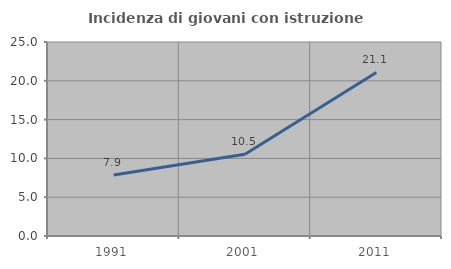
| Category | Incidenza di giovani con istruzione universitaria |
|---|---|
| 1991.0 | 7.856 |
| 2001.0 | 10.526 |
| 2011.0 | 21.075 |